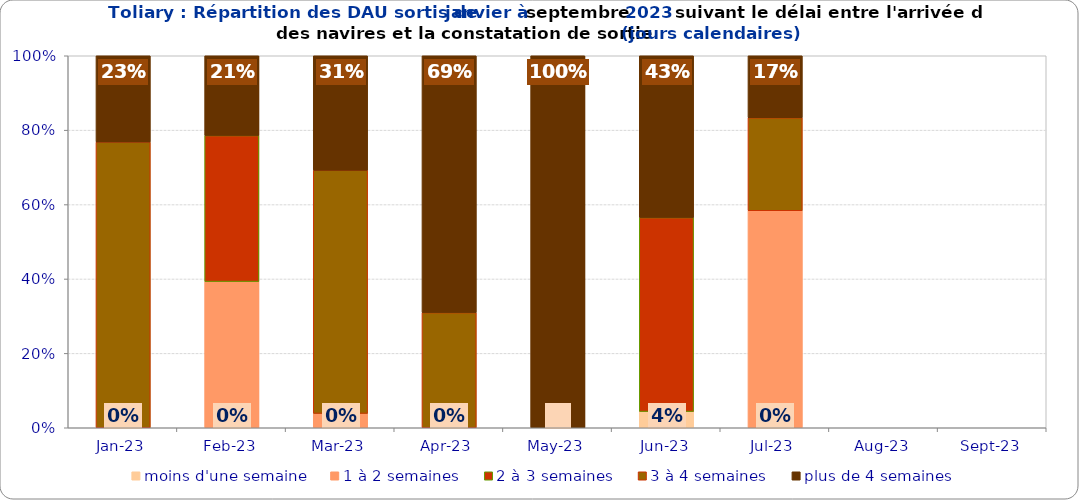
| Category | moins d'une semaine | 1 à 2 semaines | 2 à 3 semaines | 3 à 4 semaines | plus de 4 semaines |
|---|---|---|---|---|---|
| 2023-01-01 | 0 | 0 | 0 | 0.768 | 0.232 |
| 2023-02-01 | 0 | 0.393 | 0.393 | 0 | 0.214 |
| 2023-03-01 | 0 | 0.038 | 0 | 0.654 | 0.308 |
| 2023-04-01 | 0 | 0 | 0 | 0.31 | 0.69 |
| 2023-05-01 | 0 | 0 | 0 | 0 | 1 |
| 2023-06-01 | 0.043 | 0 | 0.522 | 0 | 0.435 |
| 2023-07-01 | 0 | 0.583 | 0 | 0.25 | 0.167 |
| 2023-08-01 | 0 | 0 | 0 | 0 | 0 |
| 2023-09-01 | 0 | 0 | 0 | 0 | 0 |